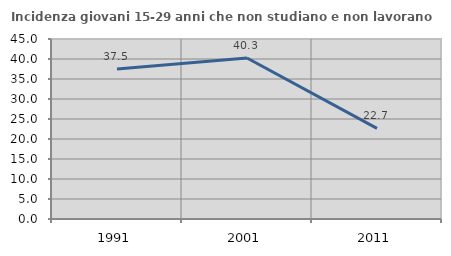
| Category | Incidenza giovani 15-29 anni che non studiano e non lavorano  |
|---|---|
| 1991.0 | 37.5 |
| 2001.0 | 40.252 |
| 2011.0 | 22.667 |